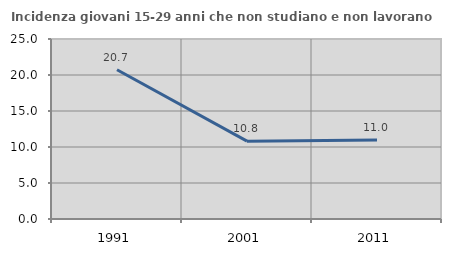
| Category | Incidenza giovani 15-29 anni che non studiano e non lavorano  |
|---|---|
| 1991.0 | 20.732 |
| 2001.0 | 10.811 |
| 2011.0 | 10.974 |